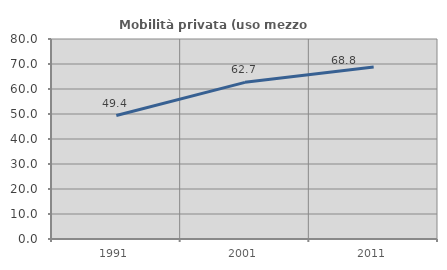
| Category | Mobilità privata (uso mezzo privato) |
|---|---|
| 1991.0 | 49.392 |
| 2001.0 | 62.662 |
| 2011.0 | 68.757 |